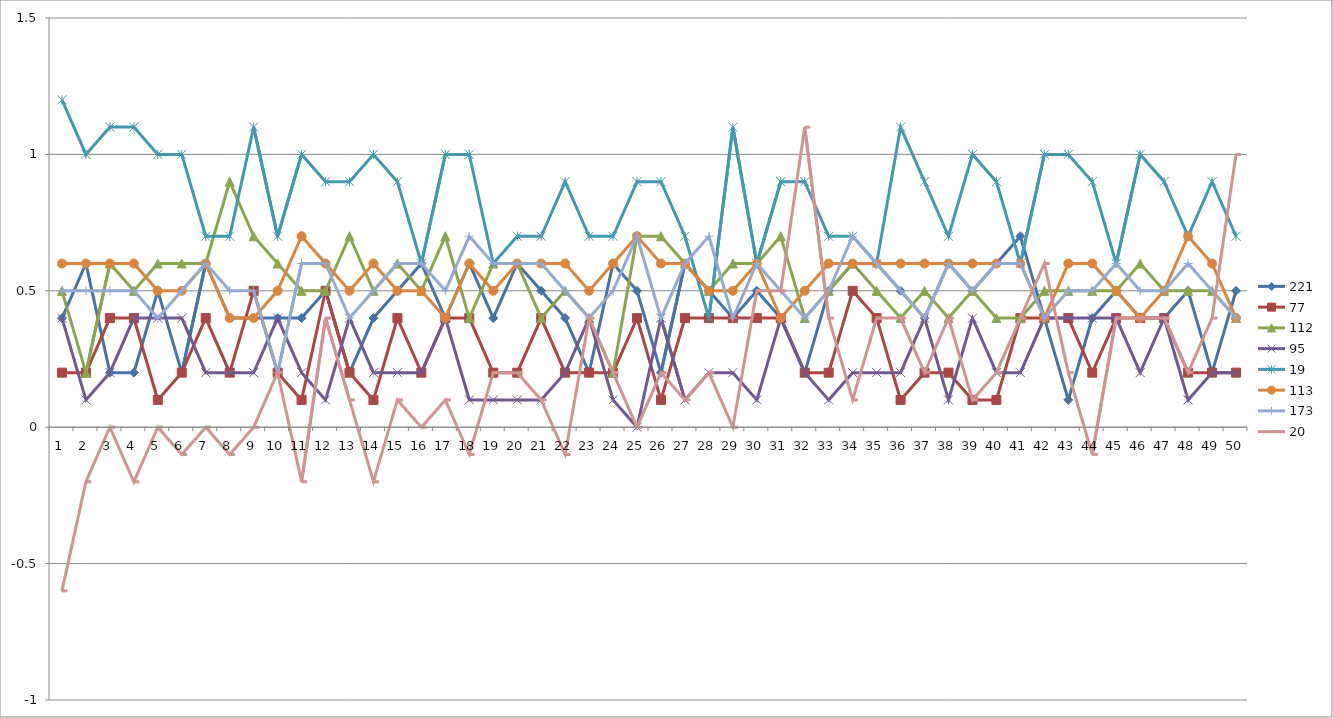
| Category | 221 | 77 | 112 | 95 | 19 | 113 | 173 | 20 |
|---|---|---|---|---|---|---|---|---|
| 0 | 0.4 | 0.2 | 0.5 | 0.4 | 1.2 | 0.6 | 0.5 | -0.6 |
| 1 | 0.6 | 0.2 | 0.2 | 0.1 | 1 | 0.6 | 0.5 | -0.2 |
| 2 | 0.2 | 0.4 | 0.6 | 0.2 | 1.1 | 0.6 | 0.5 | 0 |
| 3 | 0.2 | 0.4 | 0.5 | 0.4 | 1.1 | 0.6 | 0.5 | -0.2 |
| 4 | 0.5 | 0.1 | 0.6 | 0.4 | 1 | 0.5 | 0.4 | 0 |
| 5 | 0.2 | 0.2 | 0.6 | 0.4 | 1 | 0.5 | 0.5 | -0.1 |
| 6 | 0.6 | 0.4 | 0.6 | 0.2 | 0.7 | 0.6 | 0.6 | 0 |
| 7 | 0.4 | 0.2 | 0.9 | 0.2 | 0.7 | 0.4 | 0.5 | -0.1 |
| 8 | 0.4 | 0.5 | 0.7 | 0.2 | 1.1 | 0.4 | 0.5 | 0 |
| 9 | 0.4 | 0.2 | 0.6 | 0.4 | 0.7 | 0.5 | 0.2 | 0.2 |
| 10 | 0.4 | 0.1 | 0.5 | 0.2 | 1 | 0.7 | 0.6 | -0.2 |
| 11 | 0.5 | 0.5 | 0.5 | 0.1 | 0.9 | 0.6 | 0.6 | 0.4 |
| 12 | 0.2 | 0.2 | 0.7 | 0.4 | 0.9 | 0.5 | 0.4 | 0.1 |
| 13 | 0.4 | 0.1 | 0.5 | 0.2 | 1 | 0.6 | 0.5 | -0.2 |
| 14 | 0.5 | 0.4 | 0.6 | 0.2 | 0.9 | 0.5 | 0.6 | 0.1 |
| 15 | 0.6 | 0.2 | 0.5 | 0.2 | 0.6 | 0.5 | 0.6 | 0 |
| 16 | 0.4 | 0.4 | 0.7 | 0.4 | 1 | 0.4 | 0.5 | 0.1 |
| 17 | 0.6 | 0.4 | 0.4 | 0.1 | 1 | 0.6 | 0.7 | -0.1 |
| 18 | 0.4 | 0.2 | 0.6 | 0.1 | 0.6 | 0.5 | 0.6 | 0.2 |
| 19 | 0.6 | 0.2 | 0.6 | 0.1 | 0.7 | 0.6 | 0.6 | 0.2 |
| 20 | 0.5 | 0.4 | 0.4 | 0.1 | 0.7 | 0.6 | 0.6 | 0.1 |
| 21 | 0.4 | 0.2 | 0.5 | 0.2 | 0.9 | 0.6 | 0.5 | -0.1 |
| 22 | 0.2 | 0.2 | 0.4 | 0.4 | 0.7 | 0.5 | 0.4 | 0.4 |
| 23 | 0.6 | 0.2 | 0.2 | 0.1 | 0.7 | 0.6 | 0.5 | 0.2 |
| 24 | 0.5 | 0.4 | 0.7 | 0 | 0.9 | 0.7 | 0.7 | 0 |
| 25 | 0.2 | 0.1 | 0.7 | 0.4 | 0.9 | 0.6 | 0.4 | 0.2 |
| 26 | 0.6 | 0.4 | 0.6 | 0.1 | 0.7 | 0.6 | 0.6 | 0.1 |
| 27 | 0.5 | 0.4 | 0.5 | 0.2 | 0.4 | 0.5 | 0.7 | 0.2 |
| 28 | 0.4 | 0.4 | 0.6 | 0.2 | 1.1 | 0.5 | 0.4 | 0 |
| 29 | 0.5 | 0.4 | 0.6 | 0.1 | 0.6 | 0.6 | 0.6 | 0.5 |
| 30 | 0.4 | 0.4 | 0.7 | 0.4 | 0.9 | 0.4 | 0.5 | 0.5 |
| 31 | 0.2 | 0.2 | 0.4 | 0.2 | 0.9 | 0.5 | 0.4 | 1.1 |
| 32 | 0.5 | 0.2 | 0.5 | 0.1 | 0.7 | 0.6 | 0.5 | 0.4 |
| 33 | 0.6 | 0.5 | 0.6 | 0.2 | 0.7 | 0.6 | 0.7 | 0.1 |
| 34 | 0.6 | 0.4 | 0.5 | 0.2 | 0.6 | 0.6 | 0.6 | 0.4 |
| 35 | 0.5 | 0.1 | 0.4 | 0.2 | 1.1 | 0.6 | 0.5 | 0.4 |
| 36 | 0.4 | 0.2 | 0.5 | 0.4 | 0.9 | 0.6 | 0.4 | 0.2 |
| 37 | 0.6 | 0.2 | 0.4 | 0.1 | 0.7 | 0.6 | 0.6 | 0.4 |
| 38 | 0.5 | 0.1 | 0.5 | 0.4 | 1 | 0.6 | 0.5 | 0.1 |
| 39 | 0.6 | 0.1 | 0.4 | 0.2 | 0.9 | 0.6 | 0.6 | 0.2 |
| 40 | 0.7 | 0.4 | 0.4 | 0.2 | 0.6 | 0.6 | 0.6 | 0.4 |
| 41 | 0.4 | 0.4 | 0.5 | 0.4 | 1 | 0.4 | 0.4 | 0.6 |
| 42 | 0.1 | 0.4 | 0.5 | 0.4 | 1 | 0.6 | 0.5 | 0.2 |
| 43 | 0.4 | 0.2 | 0.5 | 0.4 | 0.9 | 0.6 | 0.5 | -0.1 |
| 44 | 0.5 | 0.4 | 0.5 | 0.4 | 0.6 | 0.5 | 0.6 | 0.4 |
| 45 | 0.4 | 0.4 | 0.6 | 0.2 | 1 | 0.4 | 0.5 | 0.4 |
| 46 | 0.4 | 0.4 | 0.5 | 0.4 | 0.9 | 0.5 | 0.5 | 0.4 |
| 47 | 0.5 | 0.2 | 0.5 | 0.1 | 0.7 | 0.7 | 0.6 | 0.2 |
| 48 | 0.2 | 0.2 | 0.5 | 0.2 | 0.9 | 0.6 | 0.5 | 0.4 |
| 49 | 0.5 | 0.2 | 0.4 | 0.2 | 0.7 | 0.4 | 0.4 | 1 |